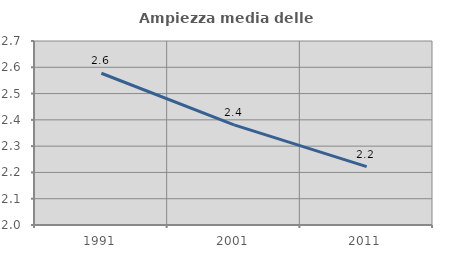
| Category | Ampiezza media delle famiglie |
|---|---|
| 1991.0 | 2.577 |
| 2001.0 | 2.381 |
| 2011.0 | 2.222 |